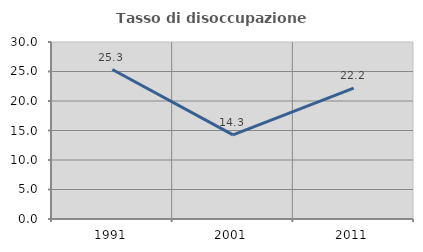
| Category | Tasso di disoccupazione giovanile  |
|---|---|
| 1991.0 | 25.336 |
| 2001.0 | 14.262 |
| 2011.0 | 22.196 |